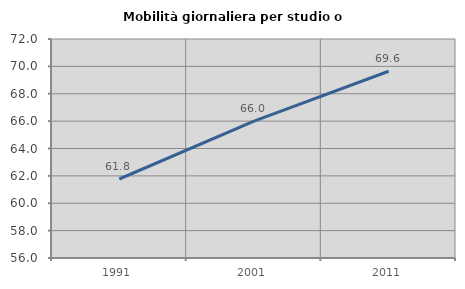
| Category | Mobilità giornaliera per studio o lavoro |
|---|---|
| 1991.0 | 61.772 |
| 2001.0 | 66.005 |
| 2011.0 | 69.645 |